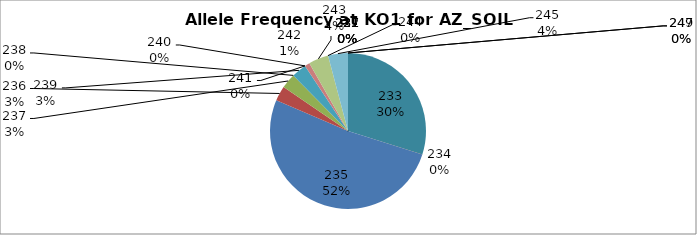
| Category | Series 0 |
|---|---|
| 221.0 | 0 |
| 227.0 | 0 |
| 231.0 | 0 |
| 232.0 | 0 |
| 233.0 | 0.299 |
| 234.0 | 0 |
| 235.0 | 0.515 |
| 236.0 | 0.031 |
| 237.0 | 0.031 |
| 238.0 | 0 |
| 239.0 | 0.031 |
| 240.0 | 0 |
| 241.0 | 0 |
| 242.0 | 0.01 |
| 243.0 | 0.041 |
| 244.0 | 0 |
| 245.0 | 0.041 |
| 247.0 | 0 |
| 249.0 | 0 |